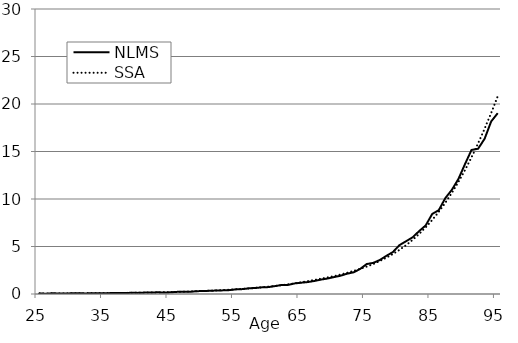
| Category | NLMS | SSA |
|---|---|---|
| 25.0 | 0.077 | 0.061 |
| 26.0 | 0.015 | 0.061 |
| 27.0 | 0.084 | 0.062 |
| 28.0 | 0.039 | 0.063 |
| 29.0 | 0.054 | 0.066 |
| 30.0 | 0.073 | 0.069 |
| 31.0 | 0.081 | 0.073 |
| 32.0 | 0.057 | 0.077 |
| 33.0 | 0.085 | 0.082 |
| 34.0 | 0.082 | 0.087 |
| 35.0 | 0.069 | 0.093 |
| 36.0 | 0.101 | 0.1 |
| 37.0 | 0.105 | 0.109 |
| 38.0 | 0.099 | 0.117 |
| 39.0 | 0.125 | 0.126 |
| 40.0 | 0.118 | 0.136 |
| 41.0 | 0.146 | 0.147 |
| 42.0 | 0.149 | 0.16 |
| 43.0 | 0.176 | 0.174 |
| 44.0 | 0.158 | 0.189 |
| 45.0 | 0.173 | 0.205 |
| 46.0 | 0.223 | 0.224 |
| 47.0 | 0.244 | 0.243 |
| 48.0 | 0.234 | 0.265 |
| 49.0 | 0.296 | 0.289 |
| 50.0 | 0.314 | 0.316 |
| 51.0 | 0.335 | 0.344 |
| 52.0 | 0.365 | 0.377 |
| 53.0 | 0.382 | 0.413 |
| 54.0 | 0.407 | 0.452 |
| 55.0 | 0.487 | 0.494 |
| 56.0 | 0.514 | 0.54 |
| 57.0 | 0.592 | 0.592 |
| 58.0 | 0.634 | 0.649 |
| 59.0 | 0.701 | 0.71 |
| 60.0 | 0.726 | 0.777 |
| 61.0 | 0.833 | 0.851 |
| 62.0 | 0.945 | 0.932 |
| 63.0 | 0.958 | 1.021 |
| 64.0 | 1.114 | 1.121 |
| 65.0 | 1.19 | 1.23 |
| 66.0 | 1.256 | 1.351 |
| 67.0 | 1.37 | 1.48 |
| 68.0 | 1.515 | 1.611 |
| 69.0 | 1.628 | 1.744 |
| 70.0 | 1.778 | 1.884 |
| 71.0 | 1.923 | 2.045 |
| 72.0 | 2.137 | 2.229 |
| 73.0 | 2.282 | 2.43 |
| 74.0 | 2.64 | 2.647 |
| 75.0 | 3.155 | 2.885 |
| 76.0 | 3.278 | 3.159 |
| 77.0 | 3.58 | 3.474 |
| 78.0 | 4.017 | 3.824 |
| 79.0 | 4.417 | 4.211 |
| 80.0 | 5.145 | 4.643 |
| 81.0 | 5.552 | 5.134 |
| 82.0 | 5.966 | 5.693 |
| 83.0 | 6.618 | 6.319 |
| 84.0 | 7.216 | 7.015 |
| 85.0 | 8.426 | 7.789 |
| 86.0 | 8.824 | 8.651 |
| 87.0 | 10.093 | 9.608 |
| 88.0 | 10.968 | 10.65 |
| 89.0 | 12.107 | 11.794 |
| 90.0 | 13.668 | 13.04 |
| 91.0 | 15.163 | 14.392 |
| 92.0 | 15.287 | 15.844 |
| 93.0 | 16.343 | 17.401 |
| 94.0 | 18.164 | 19.056 |
| 95.0 | 19.033 | 20.812 |